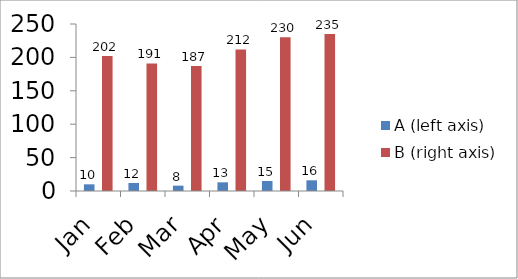
| Category | A (left axis) | B (right axis) |
|---|---|---|
| Jan | 10 | 202 |
| Feb | 12 | 191 |
| Mar | 8 | 187 |
| Apr | 13 | 212 |
| May | 15 | 230 |
| Jun | 16 | 235 |